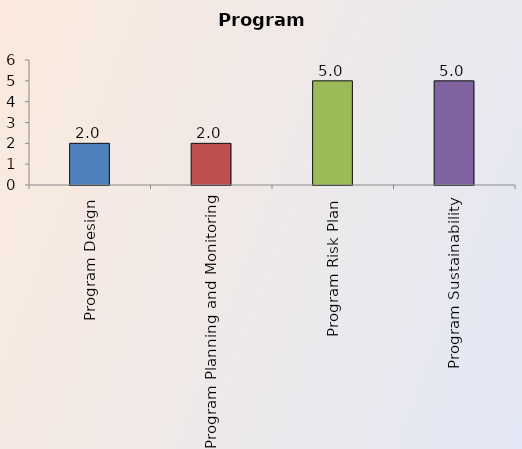
| Category | Series 0 |
|---|---|
| Program Design | 2 |
| Program Planning and Monitoring | 2 |
| Program Risk Plan | 5 |
| Program Sustainability | 5 |